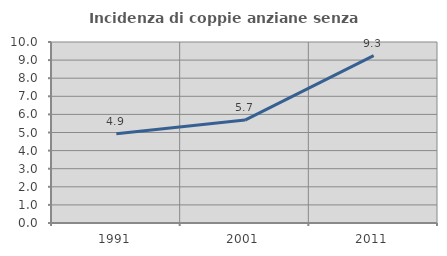
| Category | Incidenza di coppie anziane senza figli  |
|---|---|
| 1991.0 | 4.926 |
| 2001.0 | 5.687 |
| 2011.0 | 9.251 |